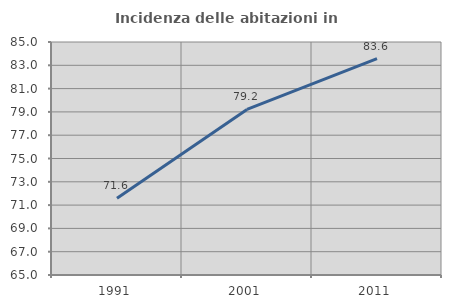
| Category | Incidenza delle abitazioni in proprietà  |
|---|---|
| 1991.0 | 71.585 |
| 2001.0 | 79.214 |
| 2011.0 | 83.564 |